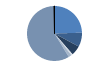
| Category | Series 0 |
|---|---|
| ARRASTRE | 341 |
| CERCO | 116 |
| PALANGRE | 80 |
| REDES DE ENMALLE | 12 |
| ARTES FIJAS | 25 |
| ARTES MENORES | 812 |
| SIN TIPO ASIGNADO | 4 |